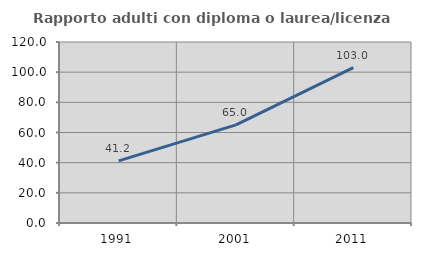
| Category | Rapporto adulti con diploma o laurea/licenza media  |
|---|---|
| 1991.0 | 41.194 |
| 2001.0 | 65.045 |
| 2011.0 | 102.992 |